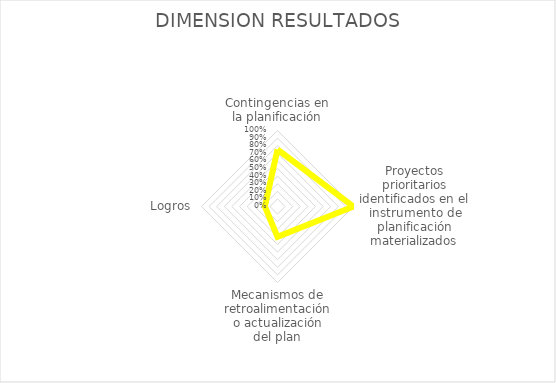
| Category | Series 0 |
|---|---|
| Contingencias en la planificación | 0.75 |
| Proyectos prioritarios identificados en el instrumento de planificación materializados | 1 |
| Mecanismos de retroalimentación o actualización del plan | 0.4 |
| Logros | 0.167 |